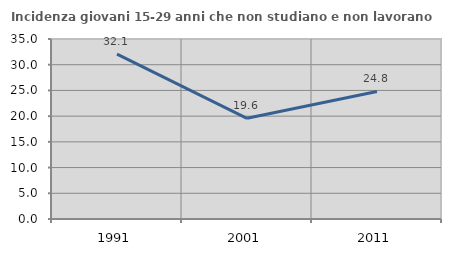
| Category | Incidenza giovani 15-29 anni che non studiano e non lavorano  |
|---|---|
| 1991.0 | 32.075 |
| 2001.0 | 19.573 |
| 2011.0 | 24.803 |